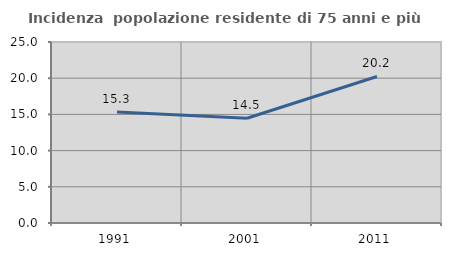
| Category | Incidenza  popolazione residente di 75 anni e più |
|---|---|
| 1991.0 | 15.337 |
| 2001.0 | 14.474 |
| 2011.0 | 20.238 |